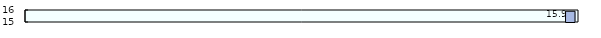
| Category | Fictive LTUR for Greece oversized |
|---|---|
| Korea | 15 |
| Mexico | 15 |
| Iceland | 15 |
| Israel | 15 |
| Norway | 15 |
| United States | 15 |
| New Zealand | 15 |
| Canada | 15 |
| Colombia | 15 |
| Sweden | 15 |
| Czech Republic | 15 |
| Japan | 15 |
| United Kingdom | 15 |
| Denmark | 15 |
| Australia | 15 |
| Poland | 15 |
| Germany | 15 |
| Hungary | 15 |
|  | 15 |
| Switzerland | 15 |
| Austria | 15 |
| Luxembourg | 15 |
| Netherlands | 15 |
| Estonia | 15 |
| Finland | 15 |
| Turkey | 15 |
| Lithuania | 15 |
| Ireland | 15 |
| Slovenia | 15 |
|  | 15 |
| Belgium | 15 |
| France | 15 |
| Portugal | 15 |
| Slovak Republic | 15 |
| Italy | 15 |
| Spain | 15 |
| Greece | 15.896 |